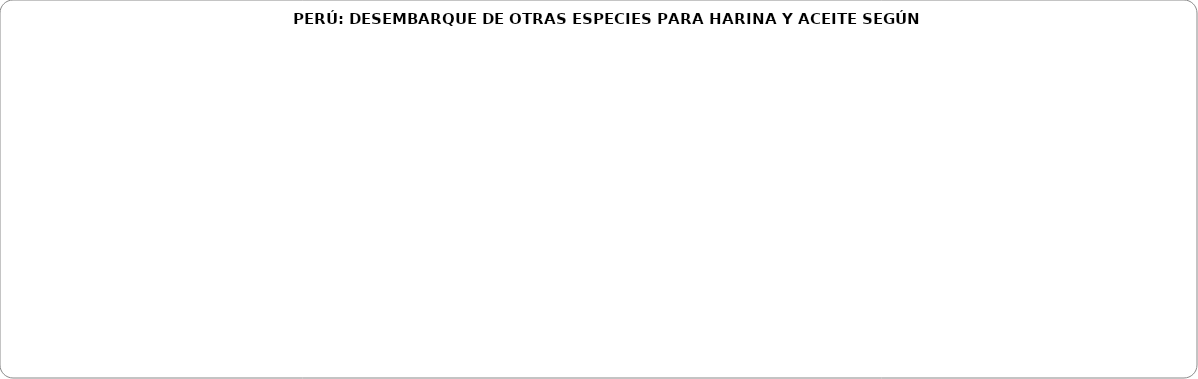
| Category | Series 0 |
|---|---|
| Chimbote | 0 |
| Callao | 0 |
| Pisco | 0 |
| Otros | 0 |